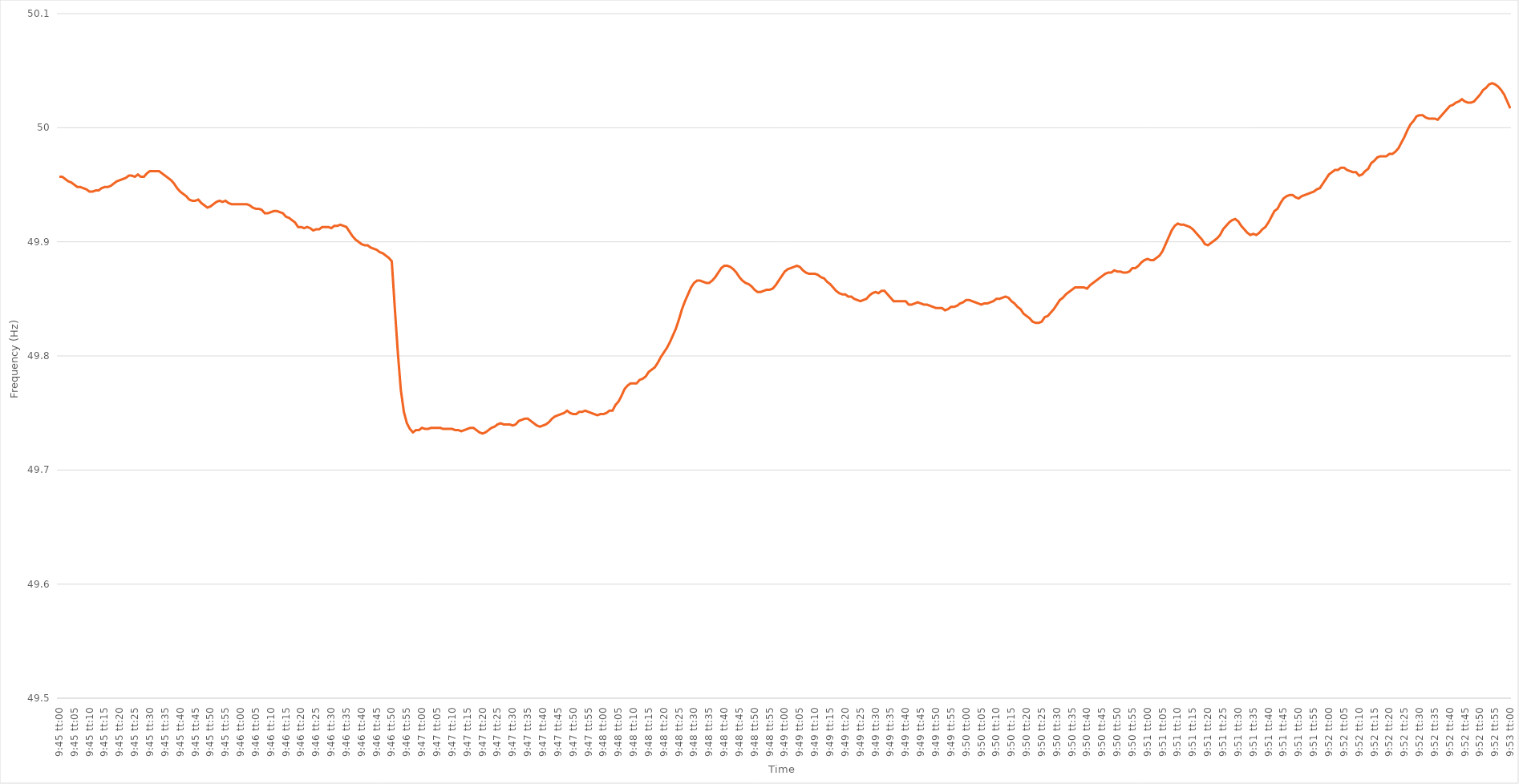
| Category | Series 0 |
|---|---|
| 0.40625 | 49.957 |
| 0.40626157407407404 | 49.957 |
| 0.40627314814814813 | 49.955 |
| 0.40628472222222217 | 49.953 |
| 0.4062962962962963 | 49.952 |
| 0.40630787037037036 | 49.95 |
| 0.40631944444444446 | 49.948 |
| 0.4063310185185185 | 49.948 |
| 0.4063425925925926 | 49.947 |
| 0.4063541666666666 | 49.946 |
| 0.4063657407407408 | 49.944 |
| 0.4063773148148148 | 49.944 |
| 0.4063888888888889 | 49.945 |
| 0.40640046296296295 | 49.945 |
| 0.40641203703703704 | 49.947 |
| 0.4064236111111111 | 49.948 |
| 0.40643518518518523 | 49.948 |
| 0.40644675925925927 | 49.949 |
| 0.40645833333333337 | 49.951 |
| 0.4064699074074074 | 49.953 |
| 0.4064814814814815 | 49.954 |
| 0.40649305555555554 | 49.955 |
| 0.4065046296296296 | 49.956 |
| 0.4065162037037037 | 49.958 |
| 0.40652777777777777 | 49.958 |
| 0.40653935185185186 | 49.957 |
| 0.4065509259259259 | 49.959 |
| 0.4065625 | 49.957 |
| 0.40657407407407403 | 49.957 |
| 0.4065856481481482 | 49.96 |
| 0.4065972222222222 | 49.962 |
| 0.4066087962962963 | 49.962 |
| 0.40662037037037035 | 49.962 |
| 0.40663194444444445 | 49.962 |
| 0.4066435185185185 | 49.96 |
| 0.40665509259259264 | 49.958 |
| 0.4066666666666667 | 49.956 |
| 0.40667824074074077 | 49.954 |
| 0.4066898148148148 | 49.951 |
| 0.4067013888888889 | 49.947 |
| 0.40671296296296294 | 49.944 |
| 0.406724537037037 | 49.942 |
| 0.40673611111111113 | 49.94 |
| 0.40674768518518517 | 49.937 |
| 0.40675925925925926 | 49.936 |
| 0.4067708333333333 | 49.936 |
| 0.4067824074074074 | 49.937 |
| 0.40679398148148144 | 49.934 |
| 0.4068055555555556 | 49.932 |
| 0.4068171296296296 | 49.93 |
| 0.4068287037037037 | 49.931 |
| 0.40684027777777776 | 49.933 |
| 0.40685185185185185 | 49.935 |
| 0.4068634259259259 | 49.936 |
| 0.40687500000000004 | 49.935 |
| 0.4068865740740741 | 49.936 |
| 0.4068981481481482 | 49.934 |
| 0.4069097222222222 | 49.933 |
| 0.4069212962962963 | 49.933 |
| 0.40693287037037035 | 49.933 |
| 0.4069444444444445 | 49.933 |
| 0.40695601851851854 | 49.933 |
| 0.4069675925925926 | 49.933 |
| 0.40697916666666667 | 49.932 |
| 0.4069907407407407 | 49.93 |
| 0.4070023148148148 | 49.929 |
| 0.40701388888888884 | 49.929 |
| 0.407025462962963 | 49.928 |
| 0.40703703703703703 | 49.925 |
| 0.4070486111111111 | 49.925 |
| 0.40706018518518516 | 49.926 |
| 0.40707175925925926 | 49.927 |
| 0.4070833333333333 | 49.927 |
| 0.40709490740740745 | 49.926 |
| 0.4071064814814815 | 49.925 |
| 0.4071180555555556 | 49.922 |
| 0.4071296296296296 | 49.921 |
| 0.4071412037037037 | 49.919 |
| 0.40715277777777775 | 49.917 |
| 0.4071643518518519 | 49.913 |
| 0.40717592592592594 | 49.913 |
| 0.40718750000000004 | 49.912 |
| 0.4071990740740741 | 49.913 |
| 0.4072106481481481 | 49.912 |
| 0.4072222222222222 | 49.91 |
| 0.40723379629629625 | 49.911 |
| 0.4072453703703704 | 49.911 |
| 0.40725694444444444 | 49.913 |
| 0.40726851851851853 | 49.913 |
| 0.40728009259259257 | 49.913 |
| 0.40729166666666666 | 49.912 |
| 0.4073032407407407 | 49.914 |
| 0.40731481481481485 | 49.914 |
| 0.4073263888888889 | 49.915 |
| 0.407337962962963 | 49.914 |
| 0.407349537037037 | 49.913 |
| 0.4073611111111111 | 49.909 |
| 0.40737268518518516 | 49.905 |
| 0.4073842592592593 | 49.902 |
| 0.40739583333333335 | 49.9 |
| 0.40740740740740744 | 49.898 |
| 0.4074189814814815 | 49.897 |
| 0.4074305555555556 | 49.897 |
| 0.4074421296296296 | 49.895 |
| 0.40745370370370365 | 49.894 |
| 0.4074652777777778 | 49.893 |
| 0.40747685185185184 | 49.891 |
| 0.40748842592592593 | 49.89 |
| 0.4075 | 49.888 |
| 0.40751157407407407 | 49.886 |
| 0.4075231481481481 | 49.883 |
| 0.40753472222222226 | 49.842 |
| 0.4075462962962963 | 49.803 |
| 0.4075578703703704 | 49.77 |
| 0.40756944444444443 | 49.751 |
| 0.4075810185185185 | 49.741 |
| 0.40759259259259256 | 49.736 |
| 0.4076041666666667 | 49.733 |
| 0.40761574074074075 | 49.735 |
| 0.40762731481481485 | 49.735 |
| 0.4076388888888889 | 49.737 |
| 0.407650462962963 | 49.736 |
| 0.407662037037037 | 49.736 |
| 0.40767361111111106 | 49.737 |
| 0.4076851851851852 | 49.737 |
| 0.40769675925925924 | 49.737 |
| 0.40770833333333334 | 49.737 |
| 0.4077199074074074 | 49.736 |
| 0.4077314814814815 | 49.736 |
| 0.4077430555555555 | 49.736 |
| 0.40775462962962966 | 49.736 |
| 0.4077662037037037 | 49.735 |
| 0.4077777777777778 | 49.735 |
| 0.40778935185185183 | 49.734 |
| 0.40780092592592593 | 49.735 |
| 0.40781249999999997 | 49.736 |
| 0.4078240740740741 | 49.737 |
| 0.40783564814814816 | 49.737 |
| 0.40784722222222225 | 49.735 |
| 0.4078587962962963 | 49.733 |
| 0.4078703703703704 | 49.732 |
| 0.4078819444444444 | 49.733 |
| 0.40789351851851857 | 49.735 |
| 0.4079050925925926 | 49.737 |
| 0.40791666666666665 | 49.738 |
| 0.40792824074074074 | 49.74 |
| 0.4079398148148148 | 49.741 |
| 0.4079513888888889 | 49.74 |
| 0.4079629629629629 | 49.74 |
| 0.40797453703703707 | 49.74 |
| 0.4079861111111111 | 49.739 |
| 0.4079976851851852 | 49.74 |
| 0.40800925925925924 | 49.743 |
| 0.40802083333333333 | 49.744 |
| 0.40803240740740737 | 49.745 |
| 0.4080439814814815 | 49.745 |
| 0.40805555555555556 | 49.743 |
| 0.40806712962962965 | 49.741 |
| 0.4080787037037037 | 49.739 |
| 0.4080902777777778 | 49.738 |
| 0.4081018518518518 | 49.739 |
| 0.408113425925926 | 49.74 |
| 0.408125 | 49.742 |
| 0.4081365740740741 | 49.745 |
| 0.40814814814814815 | 49.747 |
| 0.4081597222222222 | 49.748 |
| 0.4081712962962963 | 49.749 |
| 0.4081828703703703 | 49.75 |
| 0.40819444444444447 | 49.752 |
| 0.4082060185185185 | 49.75 |
| 0.4082175925925926 | 49.749 |
| 0.40822916666666664 | 49.749 |
| 0.40824074074074074 | 49.751 |
| 0.4082523148148148 | 49.751 |
| 0.4082638888888889 | 49.752 |
| 0.40827546296296297 | 49.751 |
| 0.40828703703703706 | 49.75 |
| 0.4082986111111111 | 49.749 |
| 0.4083101851851852 | 49.748 |
| 0.40832175925925923 | 49.749 |
| 0.4083333333333334 | 49.749 |
| 0.4083449074074074 | 49.75 |
| 0.4083564814814815 | 49.752 |
| 0.40836805555555555 | 49.752 |
| 0.40837962962962965 | 49.757 |
| 0.4083912037037037 | 49.76 |
| 0.4084027777777777 | 49.765 |
| 0.4084143518518519 | 49.771 |
| 0.4084259259259259 | 49.774 |
| 0.4084375 | 49.776 |
| 0.40844907407407405 | 49.776 |
| 0.40846064814814814 | 49.776 |
| 0.4084722222222222 | 49.779 |
| 0.40848379629629633 | 49.78 |
| 0.40849537037037037 | 49.782 |
| 0.40850694444444446 | 49.786 |
| 0.4085185185185185 | 49.788 |
| 0.4085300925925926 | 49.79 |
| 0.40854166666666664 | 49.794 |
| 0.4085532407407408 | 49.799 |
| 0.4085648148148148 | 49.803 |
| 0.4085763888888889 | 49.807 |
| 0.40858796296296296 | 49.812 |
| 0.40859953703703705 | 49.818 |
| 0.4086111111111111 | 49.824 |
| 0.40862268518518513 | 49.832 |
| 0.4086342592592593 | 49.841 |
| 0.4086458333333333 | 49.848 |
| 0.4086574074074074 | 49.854 |
| 0.40866898148148145 | 49.86 |
| 0.40868055555555555 | 49.864 |
| 0.4086921296296296 | 49.866 |
| 0.40870370370370374 | 49.866 |
| 0.4087152777777778 | 49.865 |
| 0.40872685185185187 | 49.864 |
| 0.4087384259259259 | 49.864 |
| 0.40875 | 49.866 |
| 0.40876157407407404 | 49.869 |
| 0.4087731481481482 | 49.873 |
| 0.40878472222222223 | 49.877 |
| 0.4087962962962963 | 49.879 |
| 0.40880787037037036 | 49.879 |
| 0.40881944444444446 | 49.878 |
| 0.4088310185185185 | 49.876 |
| 0.40884259259259265 | 49.873 |
| 0.4088541666666667 | 49.869 |
| 0.4088657407407407 | 49.866 |
| 0.4088773148148148 | 49.864 |
| 0.40888888888888886 | 49.863 |
| 0.40890046296296295 | 49.861 |
| 0.408912037037037 | 49.858 |
| 0.40892361111111114 | 49.856 |
| 0.4089351851851852 | 49.856 |
| 0.4089467592592593 | 49.857 |
| 0.4089583333333333 | 49.858 |
| 0.4089699074074074 | 49.858 |
| 0.40898148148148145 | 49.859 |
| 0.4089930555555556 | 49.862 |
| 0.40900462962962963 | 49.866 |
| 0.40901620370370373 | 49.87 |
| 0.40902777777777777 | 49.874 |
| 0.40903935185185186 | 49.876 |
| 0.4090509259259259 | 49.877 |
| 0.40906250000000005 | 49.878 |
| 0.4090740740740741 | 49.879 |
| 0.4090856481481482 | 49.878 |
| 0.4090972222222222 | 49.875 |
| 0.40910879629629626 | 49.873 |
| 0.40912037037037036 | 49.872 |
| 0.4091319444444444 | 49.872 |
| 0.40914351851851855 | 49.872 |
| 0.4091550925925926 | 49.871 |
| 0.4091666666666667 | 49.869 |
| 0.4091782407407407 | 49.868 |
| 0.4091898148148148 | 49.865 |
| 0.40920138888888885 | 49.863 |
| 0.409212962962963 | 49.86 |
| 0.40922453703703704 | 49.857 |
| 0.40923611111111113 | 49.855 |
| 0.4092476851851852 | 49.854 |
| 0.40925925925925927 | 49.854 |
| 0.4092708333333333 | 49.852 |
| 0.40928240740740746 | 49.852 |
| 0.4092939814814815 | 49.85 |
| 0.4093055555555556 | 49.849 |
| 0.40931712962962963 | 49.848 |
| 0.40932870370370367 | 49.849 |
| 0.40934027777777776 | 49.85 |
| 0.4093518518518518 | 49.853 |
| 0.40936342592592595 | 49.855 |
| 0.409375 | 49.856 |
| 0.4093865740740741 | 49.855 |
| 0.4093981481481481 | 49.857 |
| 0.4094097222222222 | 49.857 |
| 0.40942129629629626 | 49.854 |
| 0.4094328703703704 | 49.851 |
| 0.40944444444444444 | 49.848 |
| 0.40945601851851854 | 49.848 |
| 0.4094675925925926 | 49.848 |
| 0.40947916666666667 | 49.848 |
| 0.4094907407407407 | 49.848 |
| 0.40950231481481486 | 49.845 |
| 0.4095138888888889 | 49.845 |
| 0.409525462962963 | 49.846 |
| 0.40953703703703703 | 49.847 |
| 0.4095486111111111 | 49.846 |
| 0.40956018518518517 | 49.845 |
| 0.4095717592592592 | 49.845 |
| 0.40958333333333335 | 49.844 |
| 0.4095949074074074 | 49.843 |
| 0.4096064814814815 | 49.842 |
| 0.4096180555555555 | 49.842 |
| 0.4096296296296296 | 49.842 |
| 0.40964120370370366 | 49.84 |
| 0.4096527777777778 | 49.841 |
| 0.40966435185185185 | 49.843 |
| 0.40967592592592594 | 49.843 |
| 0.4096875 | 49.844 |
| 0.4096990740740741 | 49.846 |
| 0.4097106481481481 | 49.847 |
| 0.40972222222222227 | 49.849 |
| 0.4097337962962963 | 49.849 |
| 0.4097453703703704 | 49.848 |
| 0.40975694444444444 | 49.847 |
| 0.40976851851851853 | 49.846 |
| 0.40978009259259257 | 49.845 |
| 0.4097916666666667 | 49.846 |
| 0.40980324074074076 | 49.846 |
| 0.4098148148148148 | 49.847 |
| 0.4098263888888889 | 49.848 |
| 0.40983796296296293 | 49.85 |
| 0.409849537037037 | 49.85 |
| 0.40986111111111106 | 49.851 |
| 0.4098726851851852 | 49.852 |
| 0.40988425925925925 | 49.851 |
| 0.40989583333333335 | 49.848 |
| 0.4099074074074074 | 49.846 |
| 0.4099189814814815 | 49.843 |
| 0.4099305555555555 | 49.841 |
| 0.40994212962962967 | 49.837 |
| 0.4099537037037037 | 49.835 |
| 0.4099652777777778 | 49.833 |
| 0.40997685185185184 | 49.83 |
| 0.40998842592592594 | 49.829 |
| 0.41 | 49.829 |
| 0.4100115740740741 | 49.83 |
| 0.41002314814814816 | 49.834 |
| 0.41003472222222226 | 49.835 |
| 0.4100462962962963 | 49.838 |
| 0.41005787037037034 | 49.841 |
| 0.41006944444444443 | 49.845 |
| 0.41008101851851847 | 49.849 |
| 0.4100925925925926 | 49.851 |
| 0.41010416666666666 | 49.854 |
| 0.41011574074074075 | 49.856 |
| 0.4101273148148148 | 49.858 |
| 0.4101388888888889 | 49.86 |
| 0.4101504629629629 | 49.86 |
| 0.4101620370370371 | 49.86 |
| 0.4101736111111111 | 49.86 |
| 0.4101851851851852 | 49.859 |
| 0.41019675925925925 | 49.862 |
| 0.41020833333333334 | 49.864 |
| 0.4102199074074074 | 49.866 |
| 0.41023148148148153 | 49.868 |
| 0.41024305555555557 | 49.87 |
| 0.41025462962962966 | 49.872 |
| 0.4102662037037037 | 49.873 |
| 0.41027777777777774 | 49.873 |
| 0.41028935185185184 | 49.875 |
| 0.4103009259259259 | 49.874 |
| 0.4103125 | 49.874 |
| 0.41032407407407406 | 49.873 |
| 0.41033564814814816 | 49.873 |
| 0.4103472222222222 | 49.874 |
| 0.4103587962962963 | 49.877 |
| 0.41037037037037033 | 49.877 |
| 0.4103819444444445 | 49.879 |
| 0.4103935185185185 | 49.882 |
| 0.4104050925925926 | 49.884 |
| 0.41041666666666665 | 49.885 |
| 0.41042824074074075 | 49.884 |
| 0.4104398148148148 | 49.884 |
| 0.41045138888888894 | 49.886 |
| 0.410462962962963 | 49.888 |
| 0.41047453703703707 | 49.892 |
| 0.4104861111111111 | 49.898 |
| 0.4104976851851852 | 49.904 |
| 0.41050925925925924 | 49.91 |
| 0.4105208333333333 | 49.914 |
| 0.41053240740740743 | 49.916 |
| 0.41054398148148147 | 49.915 |
| 0.41055555555555556 | 49.915 |
| 0.4105671296296296 | 49.914 |
| 0.4105787037037037 | 49.913 |
| 0.41059027777777773 | 49.911 |
| 0.4106018518518519 | 49.908 |
| 0.4106134259259259 | 49.905 |
| 0.410625 | 49.902 |
| 0.41063657407407406 | 49.898 |
| 0.41064814814814815 | 49.897 |
| 0.4106597222222222 | 49.899 |
| 0.41067129629629634 | 49.901 |
| 0.4106828703703704 | 49.903 |
| 0.4106944444444445 | 49.906 |
| 0.4107060185185185 | 49.911 |
| 0.4107175925925926 | 49.914 |
| 0.41072916666666665 | 49.917 |
| 0.4107407407407408 | 49.919 |
| 0.41075231481481483 | 49.92 |
| 0.4107638888888889 | 49.918 |
| 0.41077546296296297 | 49.914 |
| 0.410787037037037 | 49.911 |
| 0.4107986111111111 | 49.908 |
| 0.41081018518518514 | 49.906 |
| 0.4108217592592593 | 49.907 |
| 0.41083333333333333 | 49.906 |
| 0.4108449074074074 | 49.908 |
| 0.41085648148148146 | 49.911 |
| 0.41086805555555556 | 49.913 |
| 0.4108796296296296 | 49.917 |
| 0.41089120370370374 | 49.922 |
| 0.4109027777777778 | 49.927 |
| 0.4109143518518519 | 49.929 |
| 0.4109259259259259 | 49.934 |
| 0.4109375 | 49.938 |
| 0.41094907407407405 | 49.94 |
| 0.4109606481481482 | 49.941 |
| 0.41097222222222224 | 49.941 |
| 0.41098379629629633 | 49.939 |
| 0.41099537037037037 | 49.938 |
| 0.4110069444444444 | 49.94 |
| 0.4110185185185185 | 49.941 |
| 0.41103009259259254 | 49.942 |
| 0.4110416666666667 | 49.943 |
| 0.41105324074074073 | 49.944 |
| 0.4110648148148148 | 49.946 |
| 0.41107638888888887 | 49.947 |
| 0.41108796296296296 | 49.951 |
| 0.411099537037037 | 49.955 |
| 0.41111111111111115 | 49.959 |
| 0.4111226851851852 | 49.961 |
| 0.4111342592592593 | 49.963 |
| 0.4111458333333333 | 49.963 |
| 0.4111574074074074 | 49.965 |
| 0.41116898148148145 | 49.965 |
| 0.4111805555555556 | 49.963 |
| 0.41119212962962964 | 49.962 |
| 0.41120370370370374 | 49.961 |
| 0.4112152777777778 | 49.961 |
| 0.4112268518518518 | 49.958 |
| 0.4112384259259259 | 49.959 |
| 0.41124999999999995 | 49.962 |
| 0.4112615740740741 | 49.964 |
| 0.41127314814814814 | 49.969 |
| 0.41128472222222223 | 49.971 |
| 0.41129629629629627 | 49.974 |
| 0.41130787037037037 | 49.975 |
| 0.4113194444444444 | 49.975 |
| 0.41133101851851855 | 49.975 |
| 0.4113425925925926 | 49.977 |
| 0.4113541666666667 | 49.977 |
| 0.4113657407407407 | 49.979 |
| 0.4113773148148148 | 49.982 |
| 0.41138888888888886 | 49.987 |
| 0.411400462962963 | 49.992 |
| 0.41141203703703705 | 49.998 |
| 0.41142361111111114 | 50.003 |
| 0.4114351851851852 | 50.006 |
| 0.4114467592592593 | 50.01 |
| 0.4114583333333333 | 50.011 |
| 0.41146990740740735 | 50.011 |
| 0.4114814814814815 | 50.009 |
| 0.41149305555555554 | 50.008 |
| 0.41150462962962964 | 50.008 |
| 0.4115162037037037 | 50.008 |
| 0.41152777777777777 | 50.007 |
| 0.4115393518518518 | 50.01 |
| 0.41155092592592596 | 50.013 |
| 0.4115625 | 50.016 |
| 0.4115740740740741 | 50.019 |
| 0.41158564814814813 | 50.02 |
| 0.4115972222222222 | 50.022 |
| 0.41160879629629626 | 50.023 |
| 0.4116203703703704 | 50.025 |
| 0.41163194444444445 | 50.023 |
| 0.41164351851851855 | 50.022 |
| 0.4116550925925926 | 50.022 |
| 0.4116666666666667 | 50.023 |
| 0.4116782407407407 | 50.026 |
| 0.41168981481481487 | 50.029 |
| 0.4117013888888889 | 50.033 |
| 0.41171296296296295 | 50.035 |
| 0.41172453703703704 | 50.038 |
| 0.4117361111111111 | 50.039 |
| 0.4117476851851852 | 50.038 |
| 0.4117592592592592 | 50.036 |
| 0.41177083333333336 | 50.033 |
| 0.4117824074074074 | 50.029 |
| 0.4117939814814815 | 50.023 |
| 0.41180555555555554 | 50.017 |